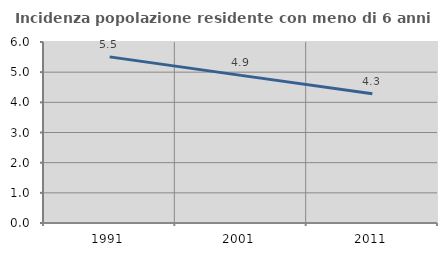
| Category | Incidenza popolazione residente con meno di 6 anni |
|---|---|
| 1991.0 | 5.506 |
| 2001.0 | 4.894 |
| 2011.0 | 4.284 |